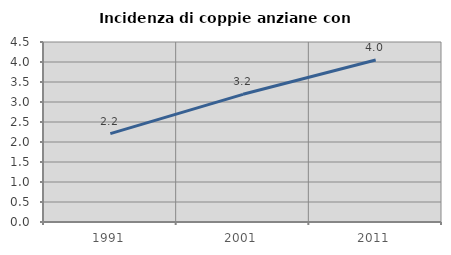
| Category | Incidenza di coppie anziane con figli |
|---|---|
| 1991.0 | 2.208 |
| 2001.0 | 3.192 |
| 2011.0 | 4.049 |